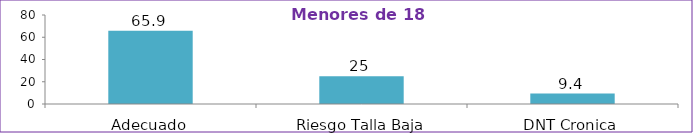
| Category | Series 0 |
|---|---|
| Adecuado | 65.9 |
| Riesgo Talla Baja | 25 |
| DNT Cronica | 9.4 |